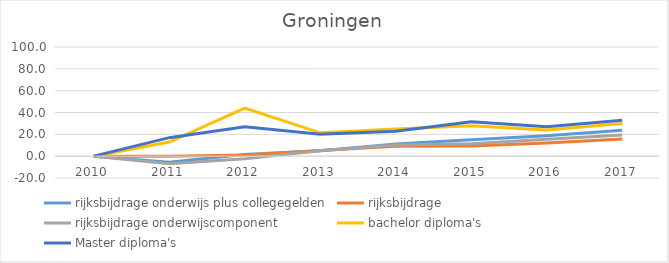
| Category | rijksbijdrage onderwijs plus collegegelden | rijksbijdrage  | rijksbijdrage onderwijscomponent | bachelor diploma's | Master diploma's |
|---|---|---|---|---|---|
| 2010.0 | 0 | 0 | 0 | 0 | 0 |
| 2011.0 | -5.457 | -0.146 | -6.887 | 12.912 | 16.967 |
| 2012.0 | 1.478 | 1.143 | -2.374 | 44.078 | 27.014 |
| 2013.0 | 5.032 | 5.16 | 5.033 | 21.368 | 20.032 |
| 2014.0 | 11.14 | 9.158 | 10.174 | 24.939 | 22.875 |
| 2015.0 | 14.933 | 9.355 | 11.306 | 27.839 | 31.627 |
| 2016.0 | 18.739 | 12.002 | 15.449 | 23.932 | 26.856 |
| 2017.0 | 23.717 | 15.775 | 19.49 | 29.976 | 32.796 |